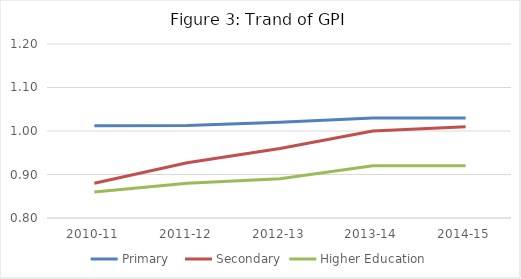
| Category | Primary
 | Secondary | Higher Education |
|---|---|---|---|
| 2010-11 | 1.012 | 0.88 | 0.86 |
| 2011-12 | 1.013 | 0.927 | 0.88 |
| 2012-13 | 1.02 | 0.96 | 0.89 |
| 2013-14 | 1.03 | 1 | 0.92 |
| 2014-15 | 1.03 | 1.01 | 0.92 |